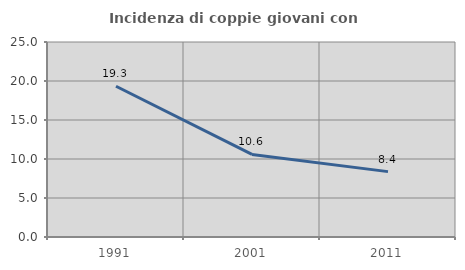
| Category | Incidenza di coppie giovani con figli |
|---|---|
| 1991.0 | 19.328 |
| 2001.0 | 10.59 |
| 2011.0 | 8.38 |